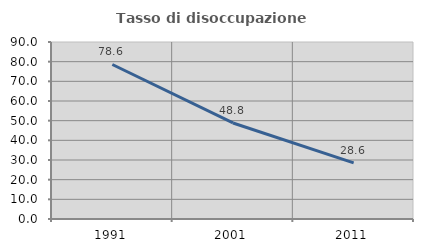
| Category | Tasso di disoccupazione giovanile  |
|---|---|
| 1991.0 | 78.571 |
| 2001.0 | 48.837 |
| 2011.0 | 28.571 |